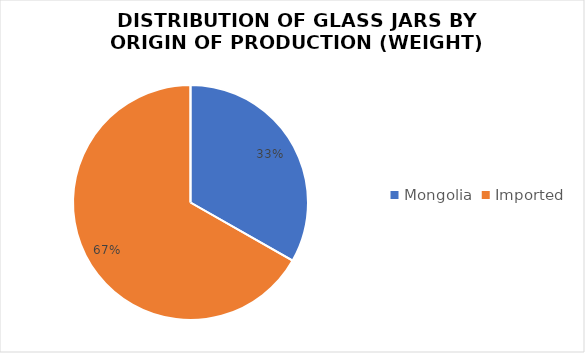
| Category | Series 0 |
|---|---|
| Mongolia | 60.68 |
| Imported | 121.95 |